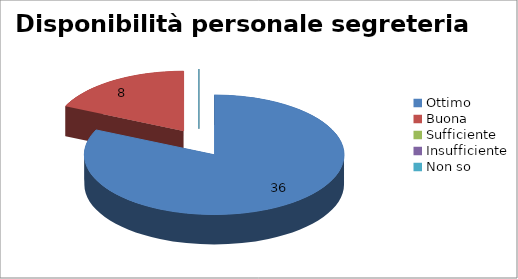
| Category | Disponibilità personale segreteria |
|---|---|
| Ottimo | 36 |
| Buona | 8 |
| Sufficiente | 0 |
| Insufficiente | 0 |
| Non so | 0 |